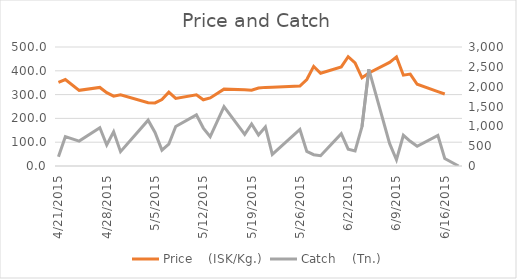
| Category | Price    (ISK/Kg.) |
|---|---|
| 6/18/15 | 0 |
| 6/16/15 | 302.474 |
| 6/15/15 | 312.567 |
| 6/12/15 | 343.323 |
| 6/11/15 | 386.174 |
| 6/10/15 | 381.649 |
| 6/9/15 | 458.567 |
| 6/8/15 | 435.298 |
| 6/5/15 | 390.716 |
| 6/4/15 | 370.509 |
| 6/3/15 | 433.435 |
| 6/2/15 | 459.317 |
| 6/1/15 | 416.497 |
| 5/29/15 | 389.89 |
| 5/28/15 | 418.417 |
| 5/27/15 | 363.334 |
| 5/26/15 | 335.65 |
| 5/22/15 | 331.074 |
| 5/21/15 | 330.347 |
| 5/20/15 | 327.896 |
| 5/19/15 | 318.161 |
| 5/18/15 | 320.498 |
| 5/15/15 | 323.001 |
| 5/13/15 | 285.936 |
| 5/12/15 | 278.072 |
| 5/11/15 | 299.072 |
| 5/8/15 | 283.999 |
| 5/7/15 | 310.331 |
| 5/6/15 | 279.329 |
| 5/5/15 | 265.106 |
| 5/4/15 | 265.491 |
| 4/30/15 | 298.763 |
| 4/29/15 | 293.468 |
| 4/28/15 | 308.155 |
| 4/27/15 | 330.082 |
| 4/24/15 | 317.996 |
| 4/22/15 | 363.2 |
| 4/21/15 | 351.042 |